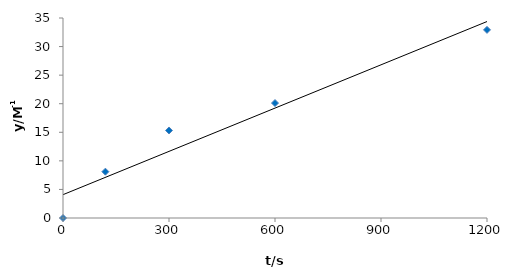
| Category | Series 0 |
|---|---|
| 0.0 | 0 |
| 120.0 | 8.11 |
| 300.0 | 15.315 |
| 600.0 | 20.119 |
| 1200.0 | 32.923 |